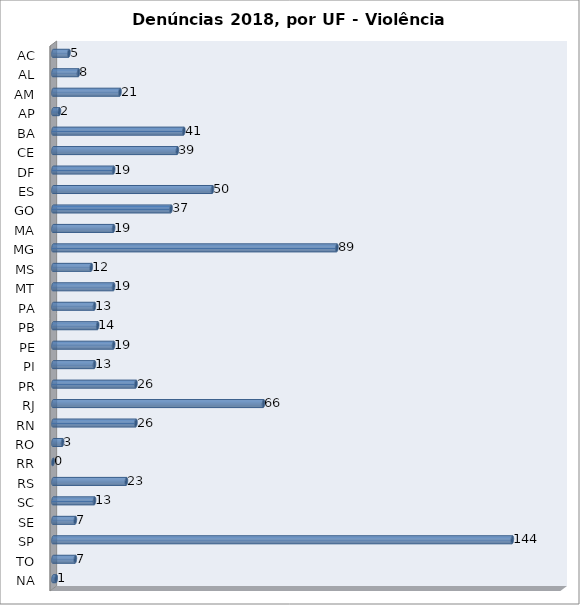
| Category | Series 0 |
|---|---|
| AC | 5 |
| AL | 8 |
| AM | 21 |
| AP | 2 |
| BA | 41 |
| CE | 39 |
| DF | 19 |
| ES | 50 |
| GO | 37 |
| MA | 19 |
| MG | 89 |
| MS | 12 |
| MT | 19 |
| PA | 13 |
| PB | 14 |
| PE | 19 |
| PI | 13 |
| PR | 26 |
| RJ | 66 |
| RN | 26 |
| RO | 3 |
| RR | 0 |
| RS | 23 |
| SC | 13 |
| SE | 7 |
| SP | 144 |
| TO | 7 |
| NA | 1 |